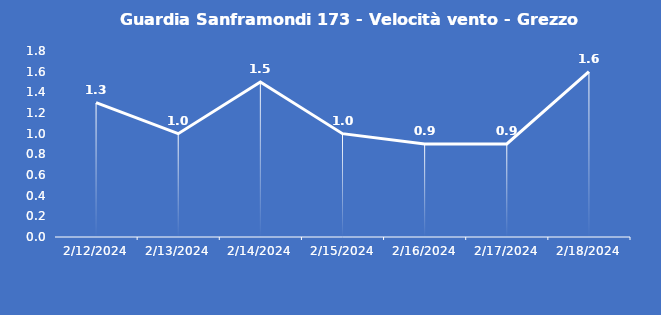
| Category | Guardia Sanframondi 173 - Velocità vento - Grezzo (m/s) |
|---|---|
| 2/12/24 | 1.3 |
| 2/13/24 | 1 |
| 2/14/24 | 1.5 |
| 2/15/24 | 1 |
| 2/16/24 | 0.9 |
| 2/17/24 | 0.9 |
| 2/18/24 | 1.6 |